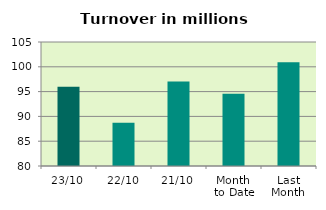
| Category | Series 0 |
|---|---|
| 23/10 | 95.96 |
| 22/10 | 88.713 |
| 21/10 | 97.042 |
| Month 
to Date | 94.55 |
| Last
Month | 100.935 |